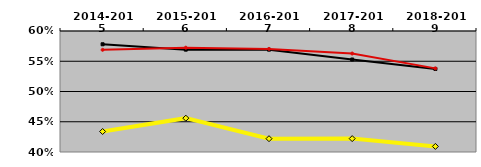
| Category | NATIONAL MEDIAN | WEST MEDIAN | TEXAS LUTHERAN |
|---|---|---|---|
| 2014-2015 | 0.578 | 0.569 | 0.434 |
| 2015-2016 | 0.569 | 0.572 | 0.456 |
| 2016-2017 | 0.569 | 0.57 | 0.422 |
| 2017-2018 | 0.553 | 0.563 | 0.422 |
| 2018-2019 | 0.537 | 0.538 | 0.409 |